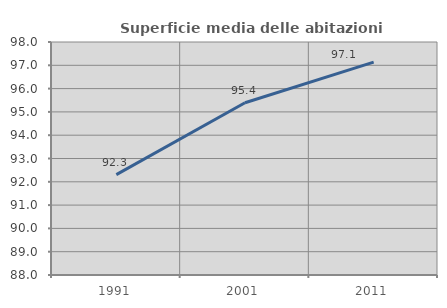
| Category | Superficie media delle abitazioni occupate |
|---|---|
| 1991.0 | 92.309 |
| 2001.0 | 95.391 |
| 2011.0 | 97.133 |